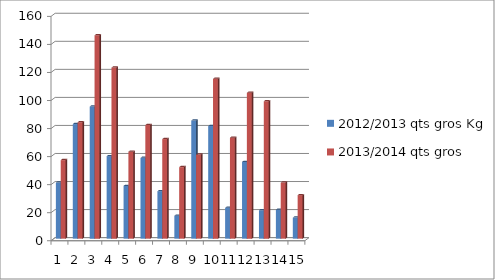
| Category | 2012/2013 qts gros Kg | 2013/2014 qts gros  |
|---|---|---|
| 0 | 40 | 56 |
| 1 | 81.7 | 83 |
| 2 | 94.2 | 145 |
| 3 | 58.8 | 122 |
| 4 | 37.6 | 62 |
| 5 | 57.6 | 81 |
| 6 | 33.8 | 71 |
| 7 | 16.3 | 51 |
| 8 | 84.2 | 60 |
| 9 | 80.3 | 114 |
| 10 | 22 | 72 |
| 11 | 54.72 | 104 |
| 12 | 20.23 | 98 |
| 13 | 20.6 | 40 |
| 14 | 15 | 31 |